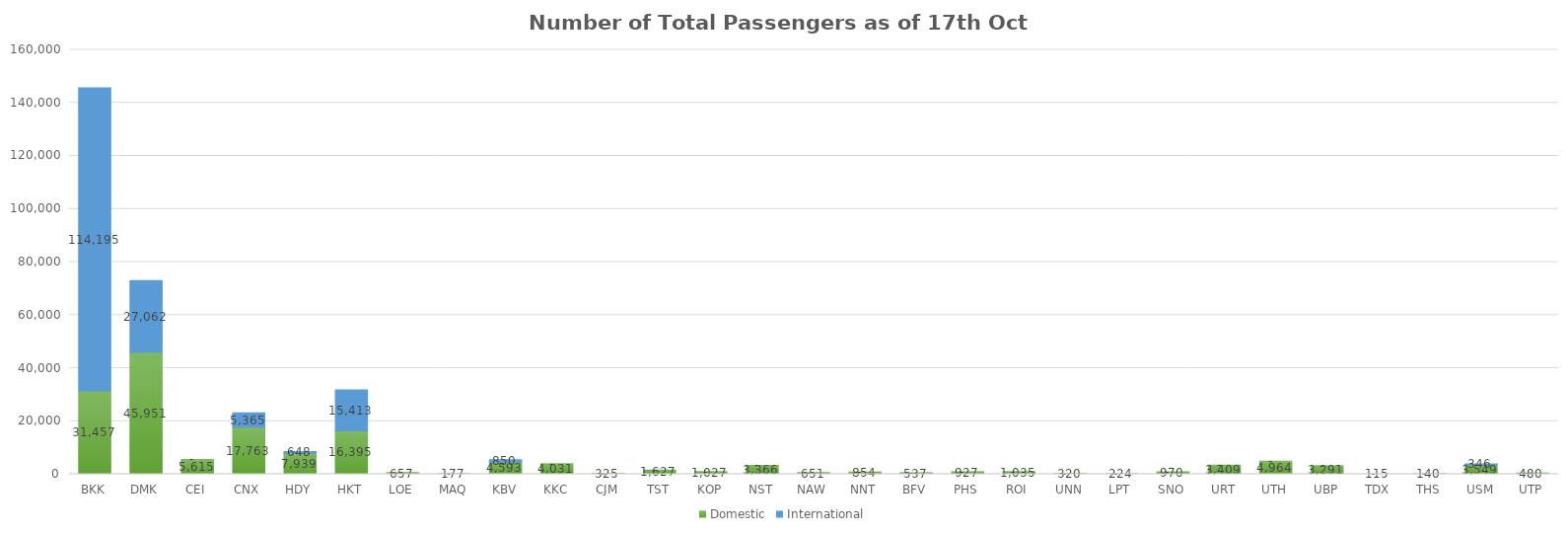
| Category | Domestic | International |
|---|---|---|
| BKK | 31457 | 114195 |
| DMK | 45951 | 27062 |
| CEI | 5615 | 0 |
| CNX | 17763 | 5365 |
| HDY | 7939 | 648 |
| HKT | 16395 | 15413 |
| LOE | 657 | 0 |
| MAQ | 177 | 0 |
| KBV | 4593 | 850 |
| KKC | 4031 | 0 |
| CJM | 325 | 0 |
| TST | 1627 | 0 |
| KOP | 1027 | 0 |
| NST | 3366 | 0 |
| NAW | 651 | 0 |
| NNT | 854 | 0 |
| BFV | 537 | 0 |
| PHS | 927 | 0 |
| ROI | 1035 | 0 |
| UNN | 320 | 0 |
| LPT | 224 | 0 |
| SNO | 970 | 0 |
| URT | 3409 | 0 |
| UTH | 4964 | 0 |
| UBP | 3291 | 0 |
| TDX | 115 | 0 |
| THS | 140 | 0 |
| USM | 3549 | 346 |
| UTP | 480 | 0 |